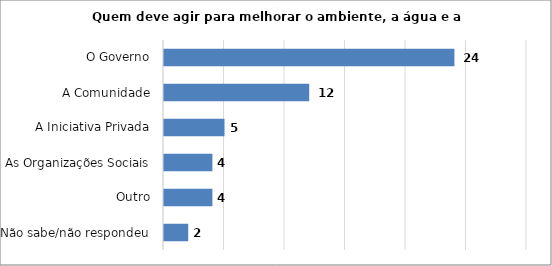
| Category | Series 0 |
|---|---|
| Não sabe/não respondeu | 2 |
| Outro | 4 |
| As Organizações Sociais | 4 |
| A Iniciativa Privada | 5 |
| A Comunidade | 12 |
| O Governo | 24 |